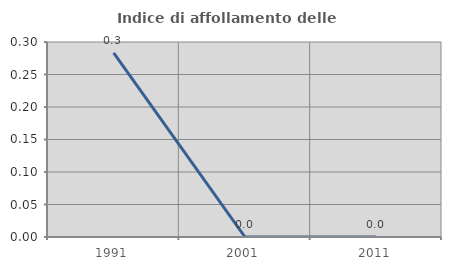
| Category | Indice di affollamento delle abitazioni  |
|---|---|
| 1991.0 | 0.283 |
| 2001.0 | 0 |
| 2011.0 | 0 |